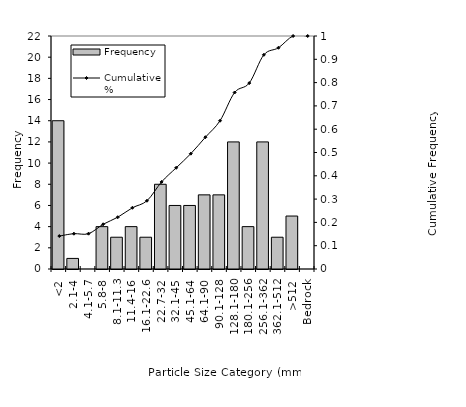
| Category | Frequency |
|---|---|
| <2 | 14 |
| 2.1-4 | 1 |
| 4.1-5.7 | 0 |
| 5.8-8 | 4 |
| 8.1-11.3 | 3 |
| 11.4-16 | 4 |
| 16.1-22.6 | 3 |
| 22.7-32 | 8 |
| 32.1-45 | 6 |
| 45.1-64 | 6 |
| 64.1-90 | 7 |
| 90.1-128 | 7 |
| 128.1-180 | 12 |
| 180.1-256 | 4 |
| 256.1-362 | 12 |
| 362.1-512 | 3 |
| >512 | 5 |
| Bedrock | 0 |